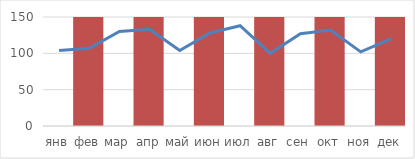
| Category | Зебра |
|---|---|
| янв | 0 |
| фев | 1 |
| мар | 0 |
| апр | 1 |
| май | 0 |
| июн | 1 |
| июл | 0 |
| авг | 1 |
| сен | 0 |
| окт | 1 |
| ноя | 0 |
| дек | 1 |